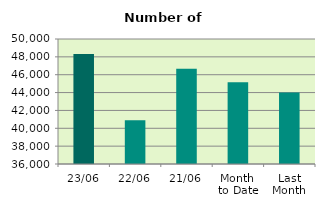
| Category | Series 0 |
|---|---|
| 23/06 | 48334 |
| 22/06 | 40906 |
| 21/06 | 46656 |
| Month 
to Date | 45169.294 |
| Last
Month | 44009.364 |